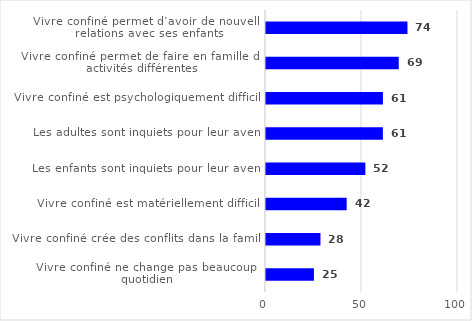
| Category | Series 0 |
|---|---|
| Vivre confiné permet d’avoir de nouvelles relations avec ses enfants | 73.68 |
| Vivre confiné permet de faire en famille des activités différentes | 69.13 |
| Vivre confiné est psychologiquement difficile | 60.89 |
| Les adultes sont inquiets pour leur avenir | 60.87 |
| Les enfants sont inquiets pour leur avenir | 51.74 |
| Vivre confiné est matériellement difficile | 42.02 |
| Vivre confiné crée des conflits dans la famille | 28.37 |
| Vivre confiné ne change pas beaucoup le quotidien | 24.96 |